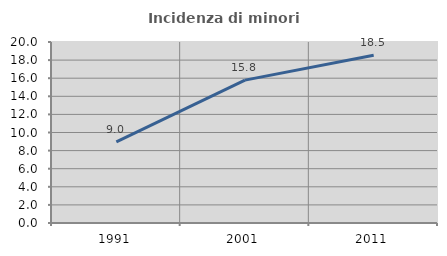
| Category | Incidenza di minori stranieri |
|---|---|
| 1991.0 | 8.974 |
| 2001.0 | 15.789 |
| 2011.0 | 18.543 |